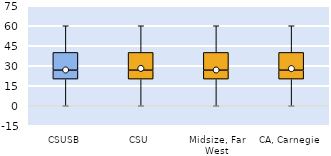
| Category | 25th | 50th | 75th |
|---|---|---|---|
| CSUSB | 20 | 6.667 | 13.333 |
| CSU | 20 | 6.667 | 13.333 |
| Midsize, Far West | 20 | 6.667 | 13.333 |
| CA, Carnegie | 20 | 6.667 | 13.333 |